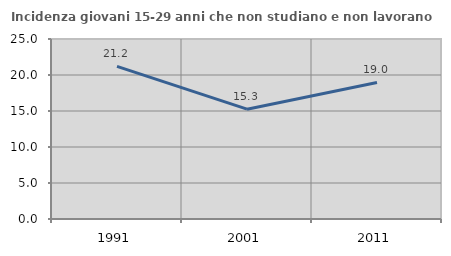
| Category | Incidenza giovani 15-29 anni che non studiano e non lavorano  |
|---|---|
| 1991.0 | 21.192 |
| 2001.0 | 15.254 |
| 2011.0 | 18.966 |